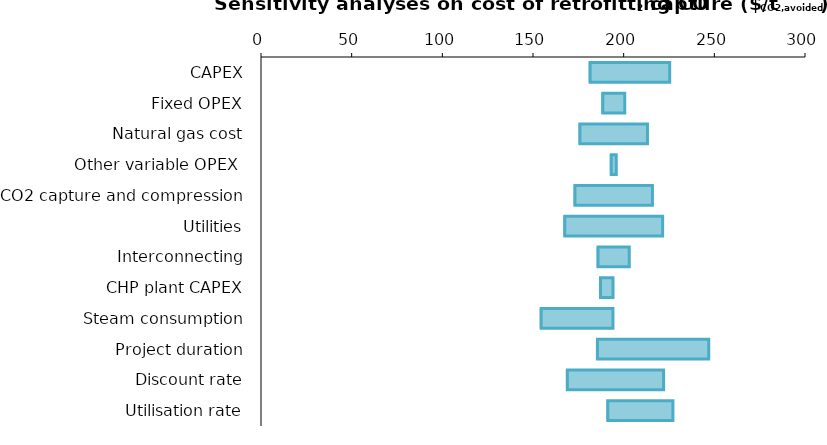
| Category | Minimum value | Increase of the parameter |
|---|---|---|
| CAPEX | 180.67 | 44.712 |
| Fixed OPEX | 187.629 | 12.911 |
| Natural gas cost | 175.046 | 38.076 |
| Other variable OPEX  | 192.299 | 3.57 |
| CO2 capture and compression | 172.306 | 43.556 |
| Utilities | 166.685 | 54.798 |
| Interconnecting | 185.036 | 18.097 |
| CHP plant CAPEX | 186.403 | 7.681 |
| Steam consumption | 153.67 | 40.414 |
| Project duration | 184.711 | 62.209 |
| Discount rate | 168.115 | 53.907 |
| Utilisation rate | 190.409 | 36.749 |